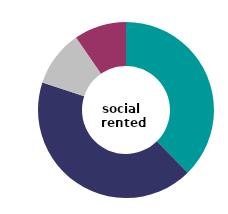
| Category | social 
rented |
|---|---|
| zero costs | 37.615 |
| £1-20/m² | 42.443 |
| £20-35/m² | 10.352 |
| £35/m² or over | 9.59 |